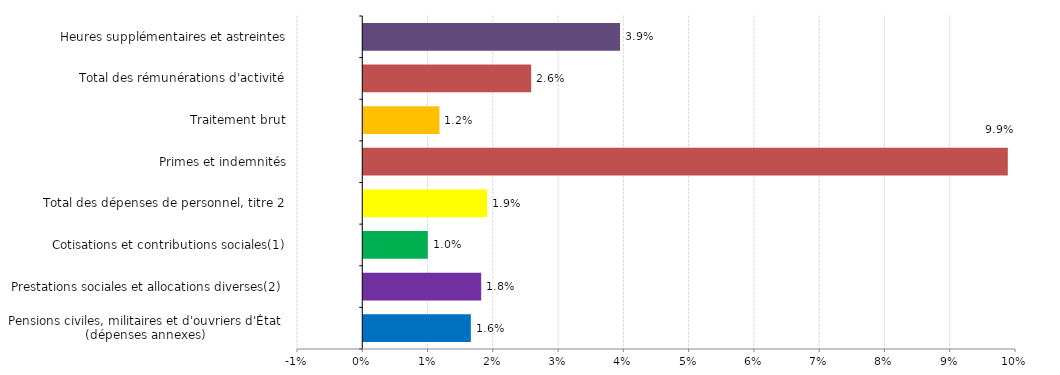
| Category | Évolution 2018/2017
(en %) |
|---|---|
| Pensions civiles, militaires et d'ouvriers d'État
(dépenses annexes) | 0.016 |
| Prestations sociales et allocations diverses(2) | 0.018 |
| Cotisations et contributions sociales(1) | 0.01 |
| Total des dépenses de personnel, titre 2 | 0.019 |
| Primes et indemnités | 0.099 |
| Traitement brut | 0.012 |
| Total des rémunérations d'activité | 0.026 |
| Heures supplémentaires et astreintes | 0.039 |